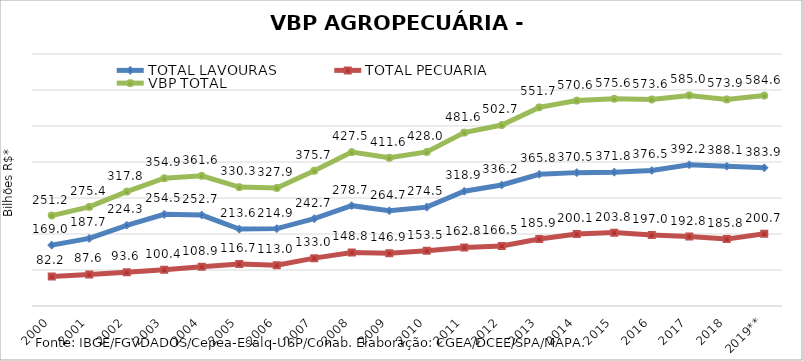
| Category | TOTAL LAVOURAS | TOTAL PECUÁRIA | VBP TOTAL |
|---|---|---|---|
| 2000 | 169.005 | 82.151 | 251.156 |
| 2001 | 187.733 | 87.645 | 275.378 |
| 2002 | 224.253 | 93.562 | 317.815 |
| 2003 | 254.526 | 100.422 | 354.948 |
| 2004 | 252.662 | 108.929 | 361.592 |
| 2005 | 213.615 | 116.69 | 330.305 |
| 2006 | 214.92 | 113.015 | 327.935 |
| 2007 | 242.713 | 132.956 | 375.669 |
| 2008 | 278.694 | 148.81 | 427.504 |
| 2009 | 264.722 | 146.875 | 411.597 |
| 2010 | 274.546 | 153.455 | 428.002 |
| 2011 | 318.852 | 162.777 | 481.629 |
| 2012 | 336.19 | 166.511 | 502.701 |
| 2013 | 365.777 | 185.889 | 551.667 |
| 2014 | 370.483 | 200.07 | 570.553 |
| 2015 | 371.828 | 203.817 | 575.644 |
| 2016 | 376.529 | 197.04 | 573.569 |
| 2017 | 392.174 | 192.806 | 584.98 |
| 2018 | 388.071 | 185.798 | 573.869 |
| 2019** | 383.891 | 200.709 | 584.6 |